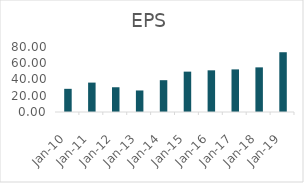
| Category | EPS |
|---|---|
| 2010-03-31 | 28.519 |
| 2011-03-31 | 36.187 |
| 2012-03-31 | 30.456 |
| 2013-03-31 | 26.506 |
| 2014-03-31 | 39.149 |
| 2015-03-31 | 49.681 |
| 2016-03-31 | 51.298 |
| 2017-03-31 | 52.44 |
| 2018-03-31 | 54.938 |
| 2019-03-31 | 73.565 |